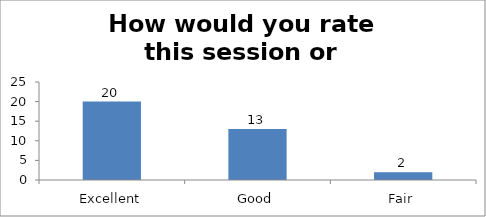
| Category | How would you rate this session or workshop? |
|---|---|
| Excellent | 20 |
| Good | 13 |
| Fair | 2 |